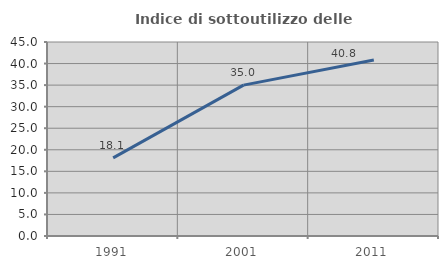
| Category | Indice di sottoutilizzo delle abitazioni  |
|---|---|
| 1991.0 | 18.113 |
| 2001.0 | 34.991 |
| 2011.0 | 40.804 |